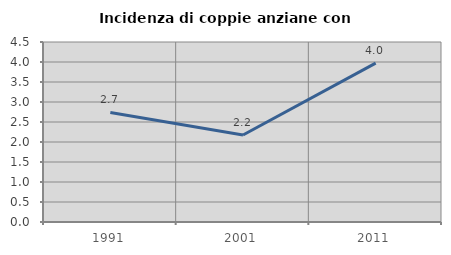
| Category | Incidenza di coppie anziane con figli |
|---|---|
| 1991.0 | 2.74 |
| 2001.0 | 2.174 |
| 2011.0 | 3.974 |